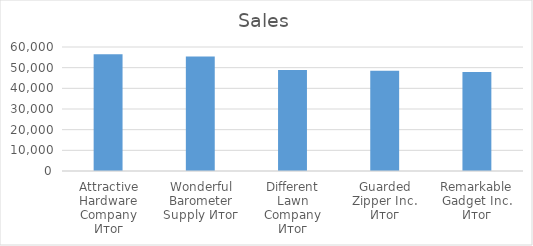
| Category | Sales |
|---|---|
| Attractive Hardware Company Итог | 56521 |
| Wonderful Barometer Supply Итог | 55403.1 |
| Different Lawn Company Итог | 48840.4 |
| Guarded Zipper Inc. Итог | 48558.7 |
| Remarkable Gadget Inc. Итог | 47934.7 |